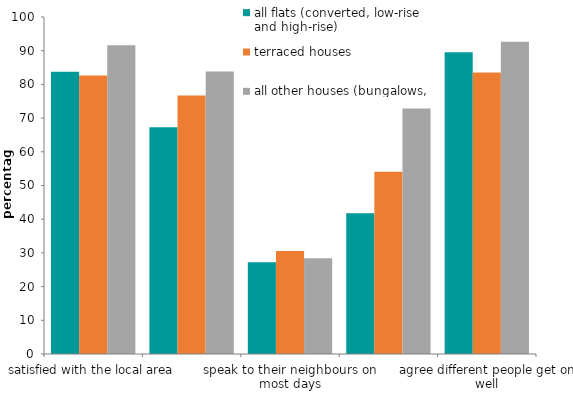
| Category | all flats (converted, low-rise and high-rise) | terraced houses | all other houses (bungalows, detached and semi-detached) |
|---|---|---|---|
| satisfied with the local area | 83.77 | 82.663 | 91.641 |
| feel they belong to the neighbourhood | 67.269 | 76.671 | 83.861 |
| speak to their neighbours on most days | 27.198 | 30.532 | 28.377 |
| feel most people can be trusted | 41.734 | 54.079 | 72.884 |
| agree different people get on well | 89.548 | 83.546 | 92.656 |